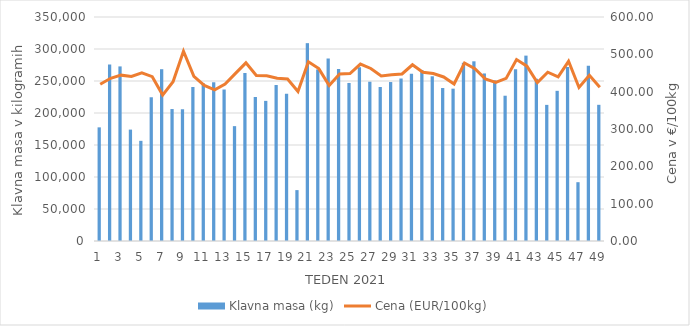
| Category | Klavna masa (kg) |
|---|---|
| 1.0 | 177573 |
| 2.0 | 275951 |
| 3.0 | 272797 |
| 4.0 | 174056 |
| 5.0 | 156508 |
| 6.0 | 224595 |
| 7.0 | 268436 |
| 8.0 | 206193 |
| 9.0 | 205669 |
| 10.0 | 240592 |
| 11.0 | 246325 |
| 12.0 | 248020 |
| 13.0 | 236703 |
| 14.0 | 179478 |
| 15.0 | 262544 |
| 16.0 | 225033 |
| 17.0 | 218950 |
| 18.0 | 243711 |
| 19.0 | 229955 |
| 20.0 | 79521 |
| 21.0 | 309134 |
| 22.0 | 268074 |
| 23.0 | 285151 |
| 24.0 | 268579 |
| 25.0 | 246944 |
| 26.0 | 271319 |
| 27.0 | 248858 |
| 28.0 | 240609 |
| 29.0 | 248383 |
| 30.0 | 253894 |
| 31.0 | 261374 |
| 32.0 | 267142 |
| 33.0 | 257352 |
| 34.0 | 239018 |
| 35.0 | 238034 |
| 36.0 | 278443 |
| 37.0 | 280772 |
| 38.0 | 261791 |
| 39.0 | 250972 |
| 40.0 | 226992 |
| 41.0 | 268523 |
| 42.0 | 289650 |
| 43.0 | 253458 |
| 44.0 | 212689 |
| 45.0 | 234635 |
| 46.0 | 272042 |
| 47.0 | 91884 |
| 48.0 | 273642 |
| 49.0 | 212789 |